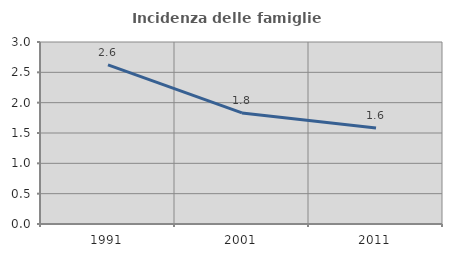
| Category | Incidenza delle famiglie numerose |
|---|---|
| 1991.0 | 2.623 |
| 2001.0 | 1.831 |
| 2011.0 | 1.583 |